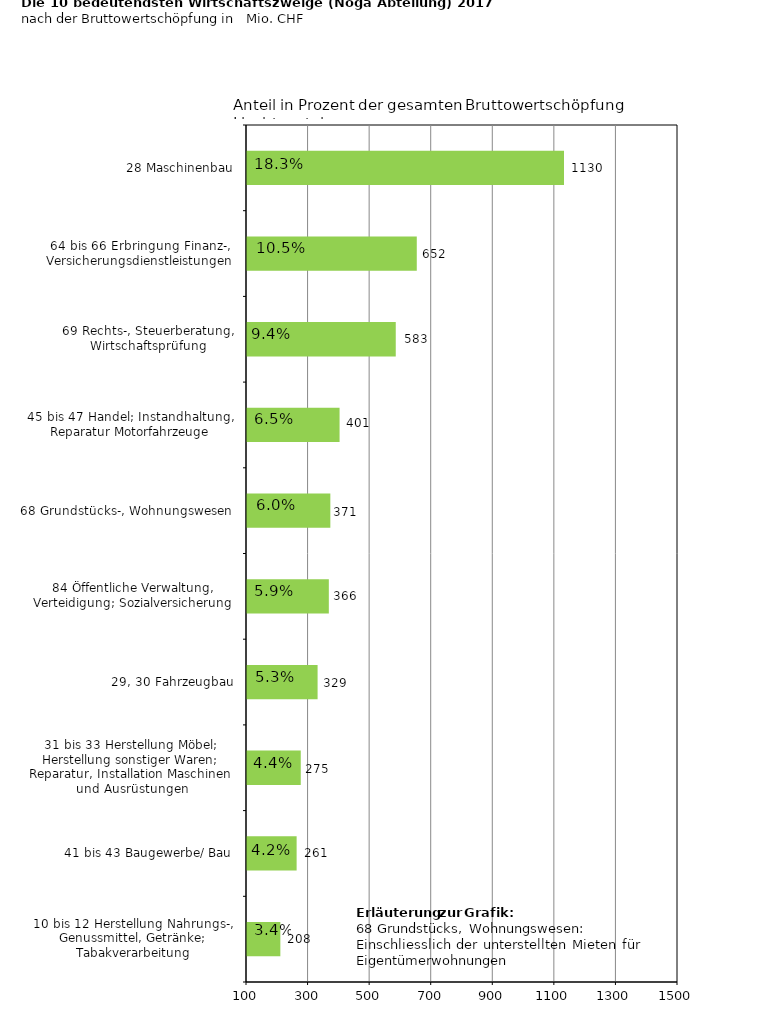
| Category | Series 0 |
|---|---|
| 28 Maschinenbau | 1129.7 |
| 64 bis 66 Erbringung Finanz-, Versicherungsdienstleistungen | 651.5 |
| 69 Rechts-, Steuerberatung, Wirtschaftsprüfung | 583.2 |
| 45 bis 47 Handel; Instandhaltung, Reparatur Motorfahrzeuge | 400.7 |
| 68 Grundstücks-, Wohnungswesen | 370.7 |
| 84 Öffentliche Verwaltung, Verteidigung; Sozialversicherung | 365.8 |
| 29, 30 Fahrzeugbau | 329.3 |
| 31 bis 33 Herstellung Möbel; Herstellung sonstiger Waren; Reparatur, Installation Maschinen und Ausrüstungen | 274.6 |
| 41 bis 43 Baugewerbe/ Bau | 261.2 |
| 10 bis 12 Herstellung Nahrungs-, Genussmittel, Getränke; Tabakverarbeitung | 208.3 |